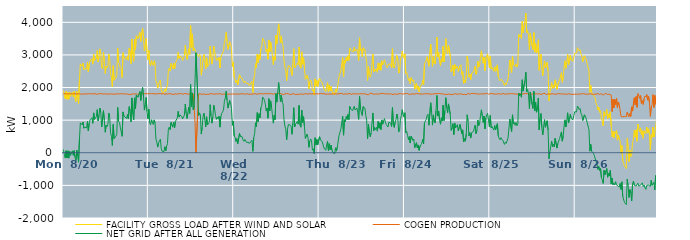
| Category | FACILITY GROSS LOAD AFTER WIND AND SOLAR | COGEN PRODUCTION | NET GRID AFTER ALL GENERATION |
|---|---|---|---|
|  Mon  8/20 | 1902 | 1803 | 99 |
|  Mon  8/20 | 1755 | 1807 | -52 |
|  Mon  8/20 | 1657 | 1813 | -156 |
|  Mon  8/20 | 1879 | 1818 | 61 |
|  Mon  8/20 | 1640 | 1801 | -161 |
|  Mon  8/20 | 1848 | 1787 | 61 |
|  Mon  8/20 | 1642 | 1806 | -164 |
|  Mon  8/20 | 1848 | 1804 | 44 |
|  Mon  8/20 | 1730 | 1809 | -79 |
|  Mon  8/20 | 1731 | 1789 | -58 |
|  Mon  8/20 | 1857 | 1799 | 58 |
|  Mon  8/20 | 1722 | 1800 | -78 |
|  Mon  8/20 | 1881 | 1815 | 66 |
|  Mon  8/20 | 1670 | 1802 | -132 |
|  Mon  8/20 | 1563 | 1801 | -238 |
|  Mon  8/20 | 1880 | 1803 | 77 |
|  Mon  8/20 | 1708 | 1808 | -100 |
|  Mon  8/20 | 1507 | 1797 | -290 |
|  Mon  8/20 | 2220 | 1808 | 412 |
|  Mon  8/20 | 2726 | 1807 | 919 |
|  Mon  8/20 | 2704 | 1798 | 906 |
|  Mon  8/20 | 2649 | 1795 | 854 |
|  Mon  8/20 | 2746 | 1802 | 944 |
|  Mon  8/20 | 2550 | 1799 | 751 |
|  Mon  8/20 | 2584 | 1801 | 783 |
|  Mon  8/20 | 2584 | 1794 | 790 |
|  Mon  8/20 | 2568 | 1803 | 765 |
|  Mon  8/20 | 2776 | 1814 | 962 |
|  Mon  8/20 | 2485 | 1814 | 671 |
|  Mon  8/20 | 2720 | 1815 | 905 |
|  Mon  8/20 | 2815 | 1805 | 1010 |
|  Mon  8/20 | 2801 | 1805 | 996 |
|  Mon  8/20 | 2882 | 1811 | 1071 |
|  Mon  8/20 | 2716 | 1813 | 903 |
|  Mon  8/20 | 3022 | 1799 | 1223 |
|  Mon  8/20 | 2831 | 1808 | 1023 |
|  Mon  8/20 | 2841 | 1819 | 1022 |
|  Mon  8/20 | 2890 | 1778 | 1112 |
|  Mon  8/20 | 3131 | 1810 | 1321 |
|  Mon  8/20 | 2782 | 1804 | 978 |
|  Mon  8/20 | 2952 | 1803 | 1149 |
|  Mon  8/20 | 3186 | 1817 | 1369 |
|  Mon  8/20 | 3048 | 1815 | 1233 |
|  Mon  8/20 | 2606 | 1815 | 791 |
|  Mon  8/20 | 2570 | 1802 | 768 |
|  Mon  8/20 | 3086 | 1795 | 1291 |
|  Mon  8/20 | 2804 | 1808 | 996 |
|  Mon  8/20 | 2429 | 1799 | 630 |
|  Mon  8/20 | 2653 | 1802 | 851 |
|  Mon  8/20 | 2615 | 1813 | 802 |
|  Mon  8/20 | 2665 | 1798 | 867 |
|  Mon  8/20 | 3025 | 1805 | 1220 |
|  Mon  8/20 | 2894 | 1802 | 1092 |
|  Mon  8/20 | 2423 | 1812 | 611 |
|  Mon  8/20 | 2305 | 1804 | 501 |
|  Mon  8/20 | 2019 | 1795 | 224 |
|  Mon  8/20 | 2670 | 1799 | 871 |
|  Mon  8/20 | 2225 | 1796 | 429 |
|  Mon  8/20 | 2216 | 1792 | 424 |
|  Mon  8/20 | 2309 | 1798 | 511 |
|  Mon  8/20 | 2377 | 1810 | 567 |
|  Mon  8/20 | 3209 | 1819 | 1390 |
|  Mon  8/20 | 2767 | 1801 | 966 |
|  Mon  8/20 | 2735 | 1806 | 929 |
|  Mon  8/20 | 2592 | 1813 | 779 |
|  Mon  8/20 | 2561 | 1807 | 754 |
|  Mon  8/20 | 2306 | 1801 | 505 |
|  Mon  8/20 | 3068 | 1815 | 1253 |
|  Mon  8/20 | 2944 | 1810 | 1134 |
|  Mon  8/20 | 2889 | 1793 | 1096 |
|  Mon  8/20 | 2902 | 1799 | 1103 |
|  Mon  8/20 | 2862 | 1809 | 1053 |
|  Mon  8/20 | 2971 | 1800 | 1171 |
|  Mon  8/20 | 2836 | 1792 | 1044 |
|  Mon  8/20 | 3204 | 1789 | 1415 |
|  Mon  8/20 | 3090 | 1801 | 1289 |
|  Mon  8/20 | 2728 | 1785 | 943 |
|  Mon  8/20 | 3489 | 1808 | 1681 |
|  Mon  8/20 | 3009 | 1811 | 1198 |
|  Mon  8/20 | 2804 | 1797 | 1007 |
|  Mon  8/20 | 3480 | 1796 | 1684 |
|  Mon  8/20 | 3170 | 1816 | 1354 |
|  Mon  8/20 | 3590 | 1815 | 1775 |
|  Mon  8/20 | 3552 | 1783 | 1769 |
|  Mon  8/20 | 3495 | 1794 | 1701 |
|  Mon  8/20 | 3615 | 1806 | 1809 |
|  Mon  8/20 | 3688 | 1808 | 1880 |
|  Mon  8/20 | 3413 | 1808 | 1605 |
|  Mon  8/20 | 3686 | 1822 | 1864 |
|  Mon  8/20 | 3810 | 1808 | 2002 |
|  Mon  8/20 | 3550 | 1810 | 1740 |
|  Mon  8/20 | 3119 | 1811 | 1308 |
|  Mon  8/20 | 3290 | 1812 | 1478 |
|  Mon  8/20 | 3510 | 1814 | 1696 |
|  Mon  8/20 | 3078 | 1814 | 1264 |
|  Mon  8/20 | 2848 | 1808 | 1040 |
|  Tue  8/21 | 3137 | 1806 | 1331 |
|  Tue  8/21 | 2726 | 1811 | 915 |
|  Tue  8/21 | 2665 | 1808 | 857 |
|  Tue  8/21 | 2826 | 1815 | 1011 |
|  Tue  8/21 | 2729 | 1806 | 923 |
|  Tue  8/21 | 2677 | 1810 | 867 |
|  Tue  8/21 | 2821 | 1812 | 1009 |
|  Tue  8/21 | 2715 | 1806 | 909 |
|  Tue  8/21 | 2219 | 1799 | 420 |
|  Tue  8/21 | 2134 | 1806 | 328 |
|  Tue  8/21 | 1981 | 1807 | 174 |
|  Tue  8/21 | 2119 | 1815 | 304 |
|  Tue  8/21 | 2138 | 1812 | 326 |
|  Tue  8/21 | 2229 | 1812 | 417 |
|  Tue  8/21 | 1936 | 1812 | 124 |
|  Tue  8/21 | 1857 | 1808 | 49 |
|  Tue  8/21 | 1865 | 1797 | 68 |
|  Tue  8/21 | 1853 | 1818 | 35 |
|  Tue  8/21 | 1963 | 1777 | 186 |
|  Tue  8/21 | 1875 | 1814 | 61 |
|  Tue  8/21 | 1999 | 1800 | 199 |
|  Tue  8/21 | 2081 | 1800 | 281 |
|  Tue  8/21 | 2524 | 1800 | 724 |
|  Tue  8/21 | 2597 | 1811 | 786 |
|  Tue  8/21 | 2504 | 1796 | 708 |
|  Tue  8/21 | 2740 | 1809 | 931 |
|  Tue  8/21 | 2697 | 1796 | 901 |
|  Tue  8/21 | 2569 | 1784 | 785 |
|  Tue  8/21 | 2739 | 1799 | 940 |
|  Tue  8/21 | 2575 | 1805 | 770 |
|  Tue  8/21 | 2756 | 1794 | 962 |
|  Tue  8/21 | 2771 | 1800 | 971 |
|  Tue  8/21 | 2866 | 1801 | 1065 |
|  Tue  8/21 | 3076 | 1806 | 1270 |
|  Tue  8/21 | 2895 | 1801 | 1094 |
|  Tue  8/21 | 2968 | 1808 | 1160 |
|  Tue  8/21 | 2942 | 1799 | 1143 |
|  Tue  8/21 | 2934 | 1820 | 1114 |
|  Tue  8/21 | 2827 | 1788 | 1039 |
|  Tue  8/21 | 2903 | 1807 | 1096 |
|  Tue  8/21 | 2970 | 1813 | 1157 |
|  Tue  8/21 | 3297 | 1804 | 1493 |
|  Tue  8/21 | 3025 | 1816 | 1209 |
|  Tue  8/21 | 2861 | 1811 | 1050 |
|  Tue  8/21 | 3029 | 1795 | 1234 |
|  Tue  8/21 | 3188 | 1796 | 1392 |
|  Tue  8/21 | 3012 | 1804 | 1208 |
|  Tue  8/21 | 3899 | 1803 | 2096 |
|  Tue  8/21 | 3227 | 1810 | 1417 |
|  Tue  8/21 | 3646 | 1811 | 1835 |
|  Tue  8/21 | 3129 | 1807 | 1322 |
|  Tue  8/21 | 3218 | 1806 | 1412 |
|  Tue  8/21 | 3150 | 914 | 2236 |
|  Tue  8/21 | 3071 | 0 | 3071 |
|  Tue  8/21 | 3087 | 0 | 3087 |
|  Tue  8/21 | 3000 | 1257 | 1743 |
|  Tue  8/21 | 2947 | 1804 | 1143 |
|  Tue  8/21 | 3019 | 1797 | 1222 |
|  Tue  8/21 | 2974 | 1806 | 1168 |
|  Tue  8/21 | 2380 | 1807 | 573 |
|  Tue  8/21 | 2567 | 1791 | 776 |
|  Tue  8/21 | 2898 | 1796 | 1102 |
|  Tue  8/21 | 3015 | 1804 | 1211 |
|  Tue  8/21 | 2819 | 1789 | 1030 |
|  Tue  8/21 | 2577 | 1786 | 791 |
|  Tue  8/21 | 2912 | 1808 | 1104 |
|  Tue  8/21 | 2644 | 1793 | 851 |
|  Tue  8/21 | 2657 | 1814 | 843 |
|  Tue  8/21 | 2733 | 1795 | 938 |
|  Tue  8/21 | 3267 | 1793 | 1474 |
|  Tue  8/21 | 2931 | 1817 | 1114 |
|  Tue  8/21 | 2718 | 1811 | 907 |
|  Tue  8/21 | 2896 | 1799 | 1097 |
|  Tue  8/21 | 3264 | 1805 | 1459 |
|  Tue  8/21 | 3126 | 1800 | 1326 |
|  Tue  8/21 | 2945 | 1792 | 1153 |
|  Tue  8/21 | 2830 | 1806 | 1024 |
|  Tue  8/21 | 2896 | 1800 | 1096 |
|  Tue  8/21 | 2838 | 1802 | 1036 |
|  Tue  8/21 | 2926 | 1803 | 1123 |
|  Tue  8/21 | 2604 | 1818 | 786 |
|  Tue  8/21 | 2920 | 1806 | 1114 |
|  Tue  8/21 | 2999 | 1790 | 1209 |
|  Tue  8/21 | 3065 | 1810 | 1255 |
|  Tue  8/21 | 3113 | 1800 | 1313 |
|  Tue  8/21 | 3377 | 1800 | 1577 |
|  Tue  8/21 | 3482 | 1801 | 1681 |
|  Tue  8/21 | 3697 | 1808 | 1889 |
|  Tue  8/21 | 3393 | 1791 | 1602 |
|  Tue  8/21 | 3169 | 1800 | 1369 |
|  Tue  8/21 | 3177 | 1799 | 1378 |
|  Tue  8/21 | 3403 | 1801 | 1602 |
|  Tue  8/21 | 3346 | 1799 | 1547 |
|  Tue  8/21 | 3160 | 1805 | 1355 |
|  Tue  8/21 | 2643 | 1802 | 841 |
|  Tue  8/21 | 2784 | 1811 | 973 |
|  Wed  8/22 | 2315 | 1802 | 513 |
|  Wed  8/22 | 2296 | 1814 | 482 |
|  Wed  8/22 | 2146 | 1798 | 348 |
|  Wed  8/22 | 2233 | 1800 | 433 |
|  Wed  8/22 | 2078 | 1799 | 279 |
|  Wed  8/22 | 2079 | 1798 | 281 |
|  Wed  8/22 | 2391 | 1802 | 589 |
|  Wed  8/22 | 2310 | 1809 | 501 |
|  Wed  8/22 | 2305 | 1808 | 497 |
|  Wed  8/22 | 2283 | 1791 | 492 |
|  Wed  8/22 | 2199 | 1810 | 389 |
|  Wed  8/22 | 2147 | 1795 | 352 |
|  Wed  8/22 | 2199 | 1791 | 408 |
|  Wed  8/22 | 2223 | 1802 | 421 |
|  Wed  8/22 | 2126 | 1812 | 314 |
|  Wed  8/22 | 2118 | 1790 | 328 |
|  Wed  8/22 | 2126 | 1798 | 328 |
|  Wed  8/22 | 2063 | 1781 | 282 |
|  Wed  8/22 | 2079 | 1791 | 288 |
|  Wed  8/22 | 2144 | 1791 | 353 |
|  Wed  8/22 | 2186 | 1802 | 384 |
|  Wed  8/22 | 1848 | 1805 | 43 |
|  Wed  8/22 | 2264 | 1802 | 462 |
|  Wed  8/22 | 2378 | 1792 | 586 |
|  Wed  8/22 | 2733 | 1814 | 919 |
|  Wed  8/22 | 2619 | 1816 | 803 |
|  Wed  8/22 | 3023 | 1791 | 1232 |
|  Wed  8/22 | 2760 | 1808 | 952 |
|  Wed  8/22 | 3007 | 1811 | 1196 |
|  Wed  8/22 | 2868 | 1798 | 1070 |
|  Wed  8/22 | 3192 | 1811 | 1381 |
|  Wed  8/22 | 3259 | 1819 | 1440 |
|  Wed  8/22 | 3513 | 1806 | 1707 |
|  Wed  8/22 | 3463 | 1792 | 1671 |
|  Wed  8/22 | 3417 | 1807 | 1610 |
|  Wed  8/22 | 3292 | 1793 | 1499 |
|  Wed  8/22 | 3103 | 1814 | 1289 |
|  Wed  8/22 | 3176 | 1804 | 1372 |
|  Wed  8/22 | 2867 | 1807 | 1060 |
|  Wed  8/22 | 3459 | 1801 | 1658 |
|  Wed  8/22 | 3094 | 1812 | 1282 |
|  Wed  8/22 | 3399 | 1807 | 1592 |
|  Wed  8/22 | 3220 | 1813 | 1407 |
|  Wed  8/22 | 2978 | 1807 | 1171 |
|  Wed  8/22 | 2704 | 1795 | 909 |
|  Wed  8/22 | 2955 | 1807 | 1148 |
|  Wed  8/22 | 2838 | 1821 | 1017 |
|  Wed  8/22 | 3601 | 1790 | 1811 |
|  Wed  8/22 | 3345 | 1791 | 1554 |
|  Wed  8/22 | 3679 | 1816 | 1863 |
|  Wed  8/22 | 3953 | 1799 | 2154 |
|  Wed  8/22 | 3660 | 1816 | 1844 |
|  Wed  8/22 | 3382 | 1810 | 1572 |
|  Wed  8/22 | 3583 | 1812 | 1771 |
|  Wed  8/22 | 3354 | 1799 | 1555 |
|  Wed  8/22 | 3283 | 1784 | 1499 |
|  Wed  8/22 | 2836 | 1814 | 1022 |
|  Wed  8/22 | 2624 | 1803 | 821 |
|  Wed  8/22 | 2543 | 1811 | 732 |
|  Wed  8/22 | 2209 | 1814 | 395 |
|  Wed  8/22 | 2538 | 1816 | 722 |
|  Wed  8/22 | 2677 | 1807 | 870 |
|  Wed  8/22 | 2649 | 1797 | 852 |
|  Wed  8/22 | 2631 | 1784 | 847 |
|  Wed  8/22 | 2617 | 1803 | 814 |
|  Wed  8/22 | 2371 | 1804 | 567 |
|  Wed  8/22 | 2718 | 1809 | 909 |
|  Wed  8/22 | 3191 | 1809 | 1382 |
|  Wed  8/22 | 2602 | 1806 | 796 |
|  Wed  8/22 | 2656 | 1783 | 873 |
|  Wed  8/22 | 2699 | 1809 | 890 |
|  Wed  8/22 | 2753 | 1793 | 960 |
|  Wed  8/22 | 2701 | 1821 | 880 |
|  Wed  8/22 | 3239 | 1788 | 1451 |
|  Wed  8/22 | 2650 | 1802 | 848 |
|  Wed  8/22 | 2593 | 1810 | 783 |
|  Wed  8/22 | 3095 | 1790 | 1305 |
|  Wed  8/22 | 2717 | 1787 | 930 |
|  Wed  8/22 | 2913 | 1805 | 1108 |
|  Wed  8/22 | 2617 | 1805 | 812 |
|  Wed  8/22 | 2250 | 1808 | 442 |
|  Wed  8/22 | 2281 | 1812 | 469 |
|  Wed  8/22 | 2378 | 1809 | 569 |
|  Wed  8/22 | 2266 | 1798 | 468 |
|  Wed  8/22 | 1964 | 1797 | 167 |
|  Wed  8/22 | 2168 | 1812 | 356 |
|  Wed  8/22 | 2234 | 1811 | 423 |
|  Wed  8/22 | 2175 | 1801 | 374 |
|  Wed  8/22 | 1895 | 1815 | 80 |
|  Wed  8/22 | 1933 | 1810 | 123 |
|  Wed  8/22 | 1768 | 1794 | -26 |
|  Wed  8/22 | 2267 | 1806 | 461 |
|  Wed  8/22 | 2045 | 1804 | 241 |
|  Wed  8/22 | 2216 | 1807 | 409 |
|  Wed  8/22 | 2032 | 1787 | 245 |
|  Wed  8/22 | 2021 | 1803 | 218 |
|  Thu  8/23 | 2290 | 1798 | 492 |
|  Thu  8/23 | 2223 | 1820 | 403 |
|  Thu  8/23 | 2211 | 1792 | 419 |
|  Thu  8/23 | 2146 | 1811 | 335 |
|  Thu  8/23 | 2147 | 1807 | 340 |
|  Thu  8/23 | 1957 | 1811 | 146 |
|  Thu  8/23 | 1956 | 1806 | 150 |
|  Thu  8/23 | 1869 | 1793 | 76 |
|  Thu  8/23 | 2016 | 1782 | 234 |
|  Thu  8/23 | 2151 | 1801 | 350 |
|  Thu  8/23 | 1870 | 1800 | 70 |
|  Thu  8/23 | 2080 | 1801 | 279 |
|  Thu  8/23 | 1898 | 1812 | 86 |
|  Thu  8/23 | 2034 | 1801 | 233 |
|  Thu  8/23 | 1888 | 1811 | 77 |
|  Thu  8/23 | 1804 | 1800 | 4 |
|  Thu  8/23 | 1846 | 1820 | 26 |
|  Thu  8/23 | 1779 | 1810 | -31 |
|  Thu  8/23 | 1953 | 1800 | 153 |
|  Thu  8/23 | 1856 | 1805 | 51 |
|  Thu  8/23 | 1975 | 1799 | 176 |
|  Thu  8/23 | 1962 | 1803 | 159 |
|  Thu  8/23 | 2342 | 1801 | 541 |
|  Thu  8/23 | 2366 | 1818 | 548 |
|  Thu  8/23 | 2526 | 1804 | 722 |
|  Thu  8/23 | 2508 | 1816 | 692 |
|  Thu  8/23 | 2920 | 1798 | 1122 |
|  Thu  8/23 | 2334 | 1795 | 539 |
|  Thu  8/23 | 2827 | 1814 | 1013 |
|  Thu  8/23 | 2747 | 1804 | 943 |
|  Thu  8/23 | 2919 | 1806 | 1113 |
|  Thu  8/23 | 2823 | 1800 | 1023 |
|  Thu  8/23 | 2971 | 1800 | 1171 |
|  Thu  8/23 | 2831 | 1811 | 1020 |
|  Thu  8/23 | 3216 | 1801 | 1415 |
|  Thu  8/23 | 3166 | 1814 | 1352 |
|  Thu  8/23 | 3124 | 1779 | 1345 |
|  Thu  8/23 | 3104 | 1815 | 1289 |
|  Thu  8/23 | 3100 | 1806 | 1294 |
|  Thu  8/23 | 3228 | 1804 | 1424 |
|  Thu  8/23 | 3116 | 1807 | 1309 |
|  Thu  8/23 | 3133 | 1802 | 1331 |
|  Thu  8/23 | 3172 | 1797 | 1375 |
|  Thu  8/23 | 3050 | 1808 | 1242 |
|  Thu  8/23 | 2829 | 1804 | 1025 |
|  Thu  8/23 | 3524 | 1802 | 1722 |
|  Thu  8/23 | 3145 | 1799 | 1346 |
|  Thu  8/23 | 3184 | 1812 | 1372 |
|  Thu  8/23 | 2946 | 1801 | 1145 |
|  Thu  8/23 | 3222 | 1806 | 1416 |
|  Thu  8/23 | 3226 | 1798 | 1428 |
|  Thu  8/23 | 3177 | 1808 | 1369 |
|  Thu  8/23 | 2940 | 1791 | 1149 |
|  Thu  8/23 | 2788 | 1788 | 1000 |
|  Thu  8/23 | 2218 | 1796 | 422 |
|  Thu  8/23 | 2647 | 1776 | 871 |
|  Thu  8/23 | 2408 | 1803 | 605 |
|  Thu  8/23 | 2319 | 1830 | 489 |
|  Thu  8/23 | 2415 | 1804 | 611 |
|  Thu  8/23 | 2392 | 1809 | 583 |
|  Thu  8/23 | 3030 | 1809 | 1221 |
|  Thu  8/23 | 2475 | 1797 | 678 |
|  Thu  8/23 | 2561 | 1789 | 772 |
|  Thu  8/23 | 2513 | 1800 | 713 |
|  Thu  8/23 | 2581 | 1802 | 779 |
|  Thu  8/23 | 2466 | 1803 | 663 |
|  Thu  8/23 | 2755 | 1792 | 963 |
|  Thu  8/23 | 2551 | 1799 | 752 |
|  Thu  8/23 | 2739 | 1817 | 922 |
|  Thu  8/23 | 2531 | 1819 | 712 |
|  Thu  8/23 | 2818 | 1811 | 1007 |
|  Thu  8/23 | 2692 | 1817 | 875 |
|  Thu  8/23 | 2771 | 1800 | 971 |
|  Thu  8/23 | 2854 | 1808 | 1046 |
|  Thu  8/23 | 2744 | 1804 | 940 |
|  Thu  8/23 | 2678 | 1808 | 870 |
|  Thu  8/23 | 2614 | 1789 | 825 |
|  Thu  8/23 | 2593 | 1804 | 789 |
|  Thu  8/23 | 2725 | 1787 | 938 |
|  Thu  8/23 | 2739 | 1803 | 936 |
|  Thu  8/23 | 2711 | 1802 | 909 |
|  Thu  8/23 | 2609 | 1802 | 807 |
|  Thu  8/23 | 3192 | 1802 | 1390 |
|  Thu  8/23 | 2634 | 1779 | 855 |
|  Thu  8/23 | 2599 | 1821 | 778 |
|  Thu  8/23 | 2731 | 1790 | 941 |
|  Thu  8/23 | 2826 | 1804 | 1022 |
|  Thu  8/23 | 2985 | 1796 | 1189 |
|  Thu  8/23 | 2874 | 1816 | 1058 |
|  Thu  8/23 | 2440 | 1806 | 634 |
|  Thu  8/23 | 2477 | 1800 | 677 |
|  Thu  8/23 | 2869 | 1817 | 1052 |
|  Thu  8/23 | 2940 | 1807 | 1133 |
|  Thu  8/23 | 3117 | 1798 | 1319 |
|  Thu  8/23 | 2959 | 1789 | 1170 |
|  Thu  8/23 | 2897 | 1806 | 1091 |
|  Fri  8/24 | 3031 | 1804 | 1227 |
|  Fri  8/24 | 2424 | 1814 | 610 |
|  Fri  8/24 | 2455 | 1805 | 650 |
|  Fri  8/24 | 2352 | 1816 | 536 |
|  Fri  8/24 | 2215 | 1809 | 406 |
|  Fri  8/24 | 2280 | 1788 | 492 |
|  Fri  8/24 | 2109 | 1810 | 299 |
|  Fri  8/24 | 2309 | 1797 | 512 |
|  Fri  8/24 | 2326 | 1792 | 534 |
|  Fri  8/24 | 2191 | 1810 | 381 |
|  Fri  8/24 | 2232 | 1810 | 422 |
|  Fri  8/24 | 1949 | 1796 | 153 |
|  Fri  8/24 | 1949 | 1799 | 150 |
|  Fri  8/24 | 2128 | 1821 | 307 |
|  Fri  8/24 | 1947 | 1801 | 146 |
|  Fri  8/24 | 2045 | 1806 | 239 |
|  Fri  8/24 | 1867 | 1793 | 74 |
|  Fri  8/24 | 2010 | 1803 | 207 |
|  Fri  8/24 | 2031 | 1785 | 246 |
|  Fri  8/24 | 2095 | 1800 | 295 |
|  Fri  8/24 | 2214 | 1807 | 407 |
|  Fri  8/24 | 2082 | 1804 | 278 |
|  Fri  8/24 | 2717 | 1811 | 906 |
|  Fri  8/24 | 2786 | 1809 | 977 |
|  Fri  8/24 | 2831 | 1806 | 1025 |
|  Fri  8/24 | 2950 | 1809 | 1141 |
|  Fri  8/24 | 2978 | 1797 | 1181 |
|  Fri  8/24 | 2655 | 1809 | 846 |
|  Fri  8/24 | 2673 | 1798 | 875 |
|  Fri  8/24 | 3329 | 1796 | 1533 |
|  Fri  8/24 | 3055 | 1807 | 1248 |
|  Fri  8/24 | 2646 | 1798 | 848 |
|  Fri  8/24 | 2958 | 1797 | 1161 |
|  Fri  8/24 | 2783 | 1811 | 972 |
|  Fri  8/24 | 2720 | 1805 | 915 |
|  Fri  8/24 | 3095 | 1810 | 1285 |
|  Fri  8/24 | 3547 | 1791 | 1756 |
|  Fri  8/24 | 2942 | 1813 | 1129 |
|  Fri  8/24 | 3081 | 1804 | 1277 |
|  Fri  8/24 | 2809 | 1817 | 992 |
|  Fri  8/24 | 2671 | 1796 | 875 |
|  Fri  8/24 | 2879 | 1807 | 1072 |
|  Fri  8/24 | 2801 | 1820 | 981 |
|  Fri  8/24 | 3266 | 1806 | 1460 |
|  Fri  8/24 | 2787 | 1800 | 987 |
|  Fri  8/24 | 3082 | 1786 | 1296 |
|  Fri  8/24 | 3499 | 1811 | 1688 |
|  Fri  8/24 | 3181 | 1790 | 1391 |
|  Fri  8/24 | 3035 | 1807 | 1228 |
|  Fri  8/24 | 3297 | 1798 | 1499 |
|  Fri  8/24 | 3326 | 1815 | 1511 |
|  Fri  8/24 | 2974 | 1793 | 1181 |
|  Fri  8/24 | 2487 | 1801 | 686 |
|  Fri  8/24 | 2548 | 1778 | 770 |
|  Fri  8/24 | 2683 | 1789 | 894 |
|  Fri  8/24 | 2362 | 1803 | 559 |
|  Fri  8/24 | 2713 | 1799 | 914 |
|  Fri  8/24 | 2568 | 1807 | 761 |
|  Fri  8/24 | 2586 | 1813 | 773 |
|  Fri  8/24 | 2656 | 1795 | 861 |
|  Fri  8/24 | 2492 | 1820 | 672 |
|  Fri  8/24 | 2496 | 1802 | 694 |
|  Fri  8/24 | 2668 | 1801 | 867 |
|  Fri  8/24 | 2700 | 1809 | 891 |
|  Fri  8/24 | 2398 | 1809 | 589 |
|  Fri  8/24 | 2487 | 1786 | 701 |
|  Fri  8/24 | 2132 | 1802 | 330 |
|  Fri  8/24 | 2224 | 1791 | 433 |
|  Fri  8/24 | 2144 | 1789 | 355 |
|  Fri  8/24 | 2361 | 1782 | 579 |
|  Fri  8/24 | 2967 | 1802 | 1165 |
|  Fri  8/24 | 2795 | 1819 | 976 |
|  Fri  8/24 | 2317 | 1798 | 519 |
|  Fri  8/24 | 2413 | 1796 | 617 |
|  Fri  8/24 | 2246 | 1795 | 451 |
|  Fri  8/24 | 2434 | 1821 | 613 |
|  Fri  8/24 | 2414 | 1814 | 600 |
|  Fri  8/24 | 2469 | 1815 | 654 |
|  Fri  8/24 | 2452 | 1812 | 640 |
|  Fri  8/24 | 2652 | 1809 | 843 |
|  Fri  8/24 | 2404 | 1815 | 589 |
|  Fri  8/24 | 2491 | 1810 | 681 |
|  Fri  8/24 | 2812 | 1811 | 1001 |
|  Fri  8/24 | 2626 | 1796 | 830 |
|  Fri  8/24 | 2689 | 1810 | 879 |
|  Fri  8/24 | 2948 | 1807 | 1141 |
|  Fri  8/24 | 3126 | 1809 | 1317 |
|  Fri  8/24 | 2924 | 1802 | 1122 |
|  Fri  8/24 | 2741 | 1814 | 927 |
|  Fri  8/24 | 2934 | 1807 | 1127 |
|  Fri  8/24 | 2520 | 1790 | 730 |
|  Fri  8/24 | 2876 | 1810 | 1066 |
|  Fri  8/24 | 2969 | 1809 | 1160 |
|  Fri  8/24 | 3033 | 1823 | 1210 |
|  Fri  8/24 | 2794 | 1792 | 1002 |
|  Fri  8/24 | 2612 | 1816 | 796 |
|  Sat  8/25 | 2962 | 1816 | 1146 |
|  Sat  8/25 | 2571 | 1805 | 766 |
|  Sat  8/25 | 2613 | 1811 | 802 |
|  Sat  8/25 | 2629 | 1812 | 817 |
|  Sat  8/25 | 2500 | 1806 | 694 |
|  Sat  8/25 | 2635 | 1801 | 834 |
|  Sat  8/25 | 2497 | 1797 | 700 |
|  Sat  8/25 | 2513 | 1812 | 701 |
|  Sat  8/25 | 2695 | 1803 | 892 |
|  Sat  8/25 | 2336 | 1815 | 521 |
|  Sat  8/25 | 2252 | 1811 | 441 |
|  Sat  8/25 | 2205 | 1807 | 398 |
|  Sat  8/25 | 2253 | 1789 | 464 |
|  Sat  8/25 | 2228 | 1812 | 416 |
|  Sat  8/25 | 2205 | 1820 | 385 |
|  Sat  8/25 | 2204 | 1801 | 403 |
|  Sat  8/25 | 2057 | 1802 | 255 |
|  Sat  8/25 | 2140 | 1810 | 330 |
|  Sat  8/25 | 2086 | 1796 | 290 |
|  Sat  8/25 | 2096 | 1796 | 300 |
|  Sat  8/25 | 2267 | 1811 | 456 |
|  Sat  8/25 | 2295 | 1810 | 485 |
|  Sat  8/25 | 2844 | 1809 | 1035 |
|  Sat  8/25 | 2832 | 1808 | 1024 |
|  Sat  8/25 | 2463 | 1810 | 653 |
|  Sat  8/25 | 2960 | 1796 | 1164 |
|  Sat  8/25 | 2700 | 1808 | 892 |
|  Sat  8/25 | 2722 | 1798 | 924 |
|  Sat  8/25 | 2647 | 1806 | 841 |
|  Sat  8/25 | 2728 | 1798 | 930 |
|  Sat  8/25 | 2623 | 1793 | 830 |
|  Sat  8/25 | 2696 | 1803 | 893 |
|  Sat  8/25 | 3633 | 1806 | 1827 |
|  Sat  8/25 | 3546 | 1805 | 1741 |
|  Sat  8/25 | 3615 | 1810 | 1805 |
|  Sat  8/25 | 3507 | 1804 | 1703 |
|  Sat  8/25 | 4035 | 1798 | 2237 |
|  Sat  8/25 | 3686 | 1795 | 1891 |
|  Sat  8/25 | 3681 | 1809 | 1872 |
|  Sat  8/25 | 4029 | 1814 | 2215 |
|  Sat  8/25 | 4283 | 1814 | 2469 |
|  Sat  8/25 | 3677 | 1801 | 1876 |
|  Sat  8/25 | 3746 | 1812 | 1934 |
|  Sat  8/25 | 3616 | 1810 | 1806 |
|  Sat  8/25 | 3157 | 1801 | 1356 |
|  Sat  8/25 | 3660 | 1796 | 1864 |
|  Sat  8/25 | 3681 | 1793 | 1888 |
|  Sat  8/25 | 3280 | 1804 | 1476 |
|  Sat  8/25 | 3165 | 1807 | 1358 |
|  Sat  8/25 | 3687 | 1804 | 1883 |
|  Sat  8/25 | 3084 | 1804 | 1280 |
|  Sat  8/25 | 3348 | 1797 | 1551 |
|  Sat  8/25 | 3056 | 1812 | 1244 |
|  Sat  8/25 | 3128 | 1797 | 1331 |
|  Sat  8/25 | 3468 | 1792 | 1676 |
|  Sat  8/25 | 2529 | 1828 | 701 |
|  Sat  8/25 | 2844 | 1791 | 1053 |
|  Sat  8/25 | 3024 | 1820 | 1204 |
|  Sat  8/25 | 2569 | 1795 | 774 |
|  Sat  8/25 | 2362 | 1817 | 545 |
|  Sat  8/25 | 2613 | 1821 | 792 |
|  Sat  8/25 | 2817 | 1802 | 1015 |
|  Sat  8/25 | 2598 | 1816 | 782 |
|  Sat  8/25 | 2587 | 1780 | 807 |
|  Sat  8/25 | 2774 | 1793 | 981 |
|  Sat  8/25 | 2498 | 1808 | 690 |
|  Sat  8/25 | 1592 | 1779 | -187 |
|  Sat  8/25 | 1823 | 1796 | 27 |
|  Sat  8/25 | 1990 | 1802 | 188 |
|  Sat  8/25 | 2157 | 1806 | 351 |
|  Sat  8/25 | 1973 | 1783 | 190 |
|  Sat  8/25 | 2066 | 1806 | 260 |
|  Sat  8/25 | 1988 | 1810 | 178 |
|  Sat  8/25 | 2237 | 1792 | 445 |
|  Sat  8/25 | 2233 | 1808 | 425 |
|  Sat  8/25 | 1946 | 1802 | 144 |
|  Sat  8/25 | 2091 | 1806 | 285 |
|  Sat  8/25 | 2082 | 1814 | 268 |
|  Sat  8/25 | 2242 | 1803 | 439 |
|  Sat  8/25 | 2238 | 1804 | 434 |
|  Sat  8/25 | 2455 | 1814 | 641 |
|  Sat  8/25 | 2163 | 1807 | 356 |
|  Sat  8/25 | 2304 | 1799 | 505 |
|  Sat  8/25 | 2613 | 1796 | 817 |
|  Sat  8/25 | 2821 | 1812 | 1009 |
|  Sat  8/25 | 2590 | 1799 | 791 |
|  Sat  8/25 | 2761 | 1793 | 968 |
|  Sat  8/25 | 3026 | 1799 | 1227 |
|  Sat  8/25 | 2702 | 1790 | 912 |
|  Sat  8/25 | 2836 | 1812 | 1024 |
|  Sat  8/25 | 2996 | 1809 | 1187 |
|  Sat  8/25 | 2841 | 1788 | 1053 |
|  Sat  8/25 | 2851 | 1794 | 1057 |
|  Sat  8/25 | 2807 | 1793 | 1014 |
|  Sat  8/25 | 2936 | 1789 | 1147 |
|  Sat  8/25 | 3055 | 1795 | 1260 |
|  Sun  8/26 | 3065 | 1809 | 1256 |
|  Sun  8/26 | 3052 | 1801 | 1251 |
|  Sun  8/26 | 3222 | 1790 | 1432 |
|  Sun  8/26 | 3196 | 1796 | 1400 |
|  Sun  8/26 | 3121 | 1796 | 1325 |
|  Sun  8/26 | 3159 | 1801 | 1358 |
|  Sun  8/26 | 3023 | 1813 | 1210 |
|  Sun  8/26 | 2966 | 1809 | 1157 |
|  Sun  8/26 | 2794 | 1806 | 988 |
|  Sun  8/26 | 2780 | 1811 | 969 |
|  Sun  8/26 | 2974 | 1810 | 1164 |
|  Sun  8/26 | 2916 | 1796 | 1120 |
|  Sun  8/26 | 2842 | 1810 | 1032 |
|  Sun  8/26 | 2718 | 1798 | 920 |
|  Sun  8/26 | 2732 | 1800 | 932 |
|  Sun  8/26 | 2509 | 1801 | 708 |
|  Sun  8/26 | 1856 | 1806 | 50 |
|  Sun  8/26 | 2066 | 1809 | 257 |
|  Sun  8/26 | 1843 | 1797 | 46 |
|  Sun  8/26 | 1820 | 1788 | 32 |
|  Sun  8/26 | 1794 | 1806 | -12 |
|  Sun  8/26 | 1716 | 1797 | -81 |
|  Sun  8/26 | 1682 | 1793 | -111 |
|  Sun  8/26 | 1519 | 1792 | -273 |
|  Sun  8/26 | 1455 | 1801 | -346 |
|  Sun  8/26 | 1310 | 1819 | -509 |
|  Sun  8/26 | 1395 | 1814 | -419 |
|  Sun  8/26 | 1239 | 1786 | -547 |
|  Sun  8/26 | 1291 | 1772 | -481 |
|  Sun  8/26 | 1045 | 1812 | -767 |
|  Sun  8/26 | 979 | 1804 | -825 |
|  Sun  8/26 | 825 | 1764 | -939 |
|  Sun  8/26 | 1257 | 1795 | -538 |
|  Sun  8/26 | 1127 | 1796 | -669 |
|  Sun  8/26 | 1169 | 1816 | -647 |
|  Sun  8/26 | 1332 | 1818 | -486 |
|  Sun  8/26 | 1041 | 1791 | -750 |
|  Sun  8/26 | 1181 | 1809 | -628 |
|  Sun  8/26 | 1081 | 1795 | -714 |
|  Sun  8/26 | 1254 | 1794 | -540 |
|  Sun  8/26 | 815 | 1766 | -951 |
|  Sun  8/26 | 486 | 1262 | -776 |
|  Sun  8/26 | 656 | 1639 | -983 |
|  Sun  8/26 | 451 | 1375 | -924 |
|  Sun  8/26 | 649 | 1636 | -987 |
|  Sun  8/26 | 593 | 1478 | -885 |
|  Sun  8/26 | 681 | 1667 | -986 |
|  Sun  8/26 | 389 | 1385 | -996 |
|  Sun  8/26 | 530 | 1554 | -1024 |
|  Sun  8/26 | 427 | 1482 | -1055 |
|  Sun  8/26 | 367 | 1308 | -941 |
|  Sun  8/26 | -11 | 1113 | -1124 |
|  Sun  8/26 | 219 | 1109 | -890 |
|  Sun  8/26 | -244 | 1101 | -1345 |
|  Sun  8/26 | -257 | 1106 | -1363 |
|  Sun  8/26 | -413 | 1115 | -1528 |
|  Sun  8/26 | -431 | 1115 | -1546 |
|  Sun  8/26 | -483 | 1105 | -1588 |
|  Sun  8/26 | 438 | 1246 | -808 |
|  Sun  8/26 | 156 | 1162 | -1006 |
|  Sun  8/26 | -272 | 1100 | -1372 |
|  Sun  8/26 | 76 | 1206 | -1130 |
|  Sun  8/26 | -118 | 1114 | -1232 |
|  Sun  8/26 | -72 | 1408 | -1480 |
|  Sun  8/26 | 314 | 1277 | -963 |
|  Sun  8/26 | 416 | 1284 | -868 |
|  Sun  8/26 | 688 | 1683 | -995 |
|  Sun  8/26 | 478 | 1472 | -994 |
|  Sun  8/26 | 706 | 1725 | -1019 |
|  Sun  8/26 | 351 | 1395 | -1044 |
|  Sun  8/26 | 882 | 1813 | -931 |
|  Sun  8/26 | 748 | 1771 | -1023 |
|  Sun  8/26 | 646 | 1667 | -1021 |
|  Sun  8/26 | 762 | 1756 | -994 |
|  Sun  8/26 | 556 | 1515 | -959 |
|  Sun  8/26 | 672 | 1595 | -923 |
|  Sun  8/26 | 447 | 1480 | -1033 |
|  Sun  8/26 | 676 | 1663 | -987 |
|  Sun  8/26 | 664 | 1742 | -1078 |
|  Sun  8/26 | 588 | 1710 | -1122 |
|  Sun  8/26 | 787 | 1785 | -998 |
|  Sun  8/26 | 607 | 1615 | -1008 |
|  Sun  8/26 | 736 | 1728 | -992 |
|  Sun  8/26 | 563 | 1541 | -978 |
|  Sun  8/26 | 87 | 1117 | -1030 |
|  Sun  8/26 | 553 | 1399 | -846 |
|  Sun  8/26 | 476 | 1479 | -1003 |
|  Sun  8/26 | 781 | 1781 | -1000 |
|  Sun  8/26 | 482 | 1390 | -908 |
|  Sun  8/26 | 616 | 1754 | -1138 |
|  Sun  8/26 | 790 | 1489 | -699 |
|  Sun  8/26 | 1045 | 1812 | -767 |